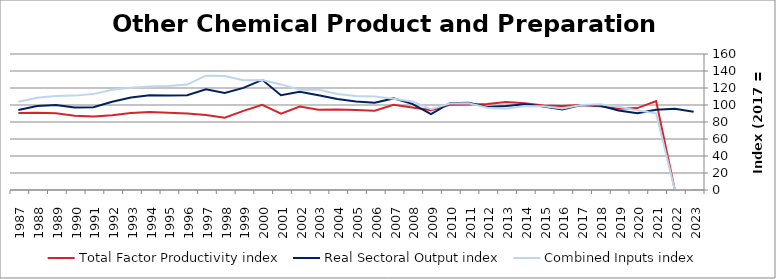
| Category | Total Factor Productivity index | Real Sectoral Output index | Combined Inputs index |
|---|---|---|---|
| 2023.0 | 0 | 92.129 | 0 |
| 2022.0 | 0 | 95.461 | 0 |
| 2021.0 | 104.719 | 94.455 | 90.199 |
| 2020.0 | 96.357 | 90.256 | 93.669 |
| 2019.0 | 95.462 | 93.467 | 97.909 |
| 2018.0 | 98.524 | 99.303 | 100.79 |
| 2017.0 | 100 | 100 | 100 |
| 2016.0 | 98.686 | 94.607 | 95.866 |
| 2015.0 | 99.512 | 98.172 | 98.654 |
| 2014.0 | 101.995 | 100.857 | 98.884 |
| 2013.0 | 103.384 | 98.943 | 95.704 |
| 2012.0 | 101.042 | 97.758 | 96.75 |
| 2011.0 | 100.451 | 102.61 | 102.149 |
| 2010.0 | 100.282 | 102.125 | 101.837 |
| 2009.0 | 93.992 | 89.372 | 95.085 |
| 2008.0 | 97.173 | 101.293 | 104.24 |
| 2007.0 | 100.315 | 107.761 | 107.423 |
| 2006.0 | 93.291 | 102.641 | 110.022 |
| 2005.0 | 94.232 | 104.197 | 110.574 |
| 2004.0 | 94.829 | 107.087 | 112.927 |
| 2003.0 | 94.306 | 111.347 | 118.07 |
| 2002.0 | 98.128 | 115.641 | 117.847 |
| 2001.0 | 89.775 | 111.524 | 124.226 |
| 2000.0 | 100.11 | 129.598 | 129.456 |
| 1999.0 | 93.083 | 120.142 | 129.07 |
| 1998.0 | 85.151 | 114.183 | 134.095 |
| 1997.0 | 88.156 | 118.597 | 134.53 |
| 1996.0 | 89.862 | 111.46 | 124.035 |
| 1995.0 | 90.99 | 111.211 | 122.223 |
| 1994.0 | 91.7 | 111.579 | 121.678 |
| 1993.0 | 90.519 | 108.814 | 120.211 |
| 1992.0 | 87.954 | 103.797 | 118.012 |
| 1991.0 | 86.383 | 97.446 | 112.808 |
| 1990.0 | 87.326 | 96.959 | 111.031 |
| 1989.0 | 90.188 | 99.865 | 110.73 |
| 1988.0 | 90.891 | 98.743 | 108.639 |
| 1987.0 | 90.549 | 94.088 | 103.909 |